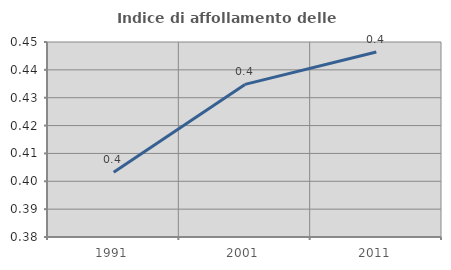
| Category | Indice di affollamento delle abitazioni  |
|---|---|
| 1991.0 | 0.403 |
| 2001.0 | 0.435 |
| 2011.0 | 0.446 |